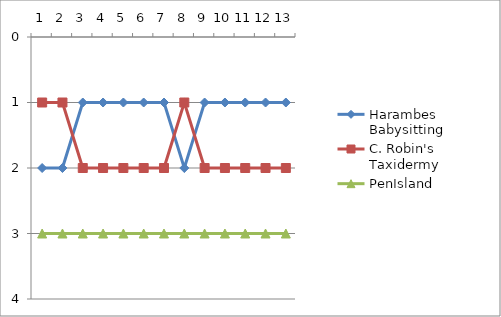
| Category | Harambes Babysitting | C. Robin's Taxidermy | PenIsland |
|---|---|---|---|
| 0 | 2 | 1 | 3 |
| 1 | 2 | 1 | 3 |
| 2 | 1 | 2 | 3 |
| 3 | 1 | 2 | 3 |
| 4 | 1 | 2 | 3 |
| 5 | 1 | 2 | 3 |
| 6 | 1 | 2 | 3 |
| 7 | 2 | 1 | 3 |
| 8 | 1 | 2 | 3 |
| 9 | 1 | 2 | 3 |
| 10 | 1 | 2 | 3 |
| 11 | 1 | 2 | 3 |
| 12 | 1 | 2 | 3 |